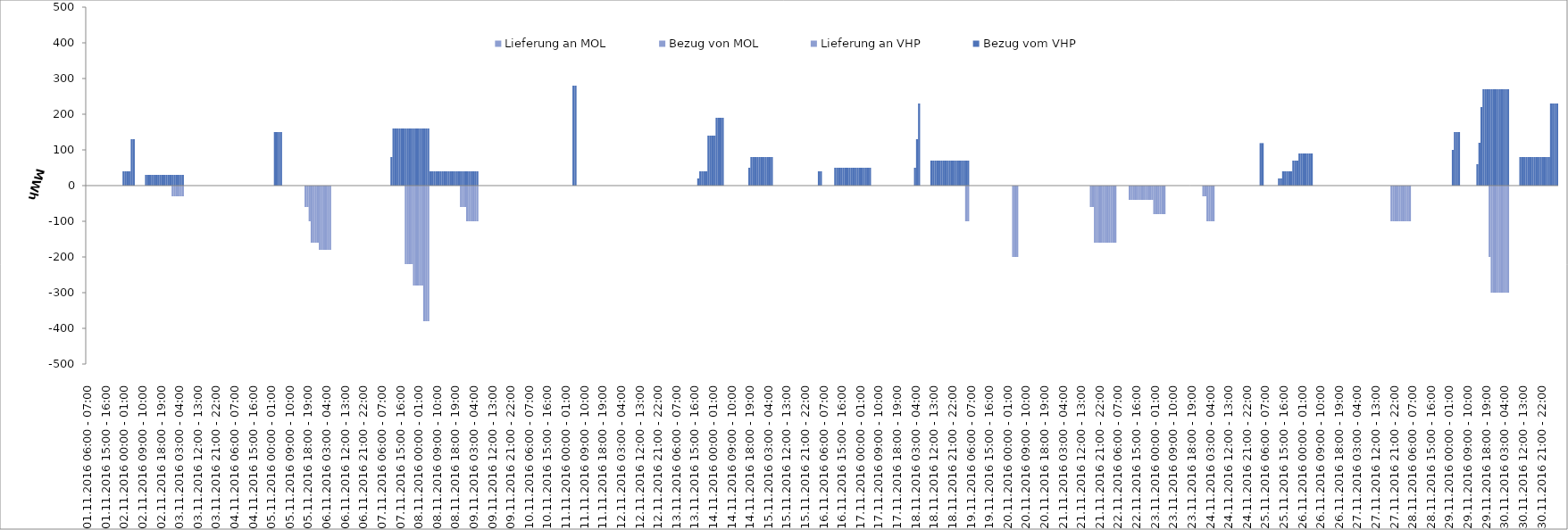
| Category | Bezug vom VHP | Lieferung an VHP | Bezug von MOL | Lieferung an MOL |
|---|---|---|---|---|
| 01.11.2016 06:00 - 07:00 | 0 | 0 | 0 | 0 |
| 01.11.2016 07:00 - 08:00 | 0 | 0 | 0 | 0 |
| 01.11.2016 08:00 - 09:00 | 0 | 0 | 0 | 0 |
| 01.11.2016 09:00 - 10:00 | 0 | 0 | 0 | 0 |
| 01.11.2016 10:00 - 11:00 | 0 | 0 | 0 | 0 |
| 01.11.2016 11:00 - 12:00 | 0 | 0 | 0 | 0 |
| 01.11.2016 12:00 - 13:00 | 0 | 0 | 0 | 0 |
| 01.11.2016 13:00 - 14:00 | 0 | 0 | 0 | 0 |
| 01.11.2016 14:00 - 15:00 | 0 | 0 | 0 | 0 |
| 01.11.2016 15:00 - 16:00 | 0 | 0 | 0 | 0 |
| 01.11.2016 16:00 - 17:00 | 0 | 0 | 0 | 0 |
| 01.11.2016 17:00 - 18:00 | 0 | 0 | 0 | 0 |
| 01.11.2016 18:00 - 19:00 | 0 | 0 | 0 | 0 |
| 01.11.2016 19:00 - 20:00 | 0 | 0 | 0 | 0 |
| 01.11.2016 20:00 - 21:00 | 0 | 0 | 0 | 0 |
| 01.11.2016 21:00 - 22:00 | 0 | 0 | 0 | 0 |
| 01.11.2016 22:00 - 23:00 | 0 | 0 | 0 | 0 |
| 01.11.2016 23:00 - 24:00 | 0 | 0 | 0 | 0 |
| 02.11.2016 00:00 - 01:00 | 40 | 0 | 0 | 0 |
| 02.11.2016 01:00 - 02:00 | 40 | 0 | 0 | 0 |
| 02.11.2016 02:00 - 03:00 | 40 | 0 | 0 | 0 |
| 02.11.2016 03:00 - 04:00 | 40 | 0 | 0 | 0 |
| 02.11.2016 04:00 - 05:00 | 130 | 0 | 0 | 0 |
| 02.11.2016 05:00 - 06:00 | 130 | 0 | 0 | 0 |
| 02.11.2016 06:00 - 07:00 | 0 | 0 | 0 | 0 |
| 02.11.2016 07:00 - 08:00 | 0 | 0 | 0 | 0 |
| 02.11.2016 08:00 - 09:00 | 0 | 0 | 0 | 0 |
| 02.11.2016 09:00 - 10:00 | 0 | 0 | 0 | 0 |
| 02.11.2016 10:00 - 11:00 | 0 | 0 | 0 | 0 |
| 02.11.2016 11:00 - 12:00 | 30 | 0 | 0 | 0 |
| 02.11.2016 12:00 - 13:00 | 30 | 0 | 0 | 0 |
| 02.11.2016 13:00 - 14:00 | 30 | 0 | 0 | 0 |
| 02.11.2016 14:00 - 15:00 | 30 | 0 | 0 | 0 |
| 02.11.2016 15:00 - 16:00 | 30 | 0 | 0 | 0 |
| 02.11.2016 16:00 - 17:00 | 30 | 0 | 0 | 0 |
| 02.11.2016 17:00 - 18:00 | 30 | 0 | 0 | 0 |
| 02.11.2016 18:00 - 19:00 | 30 | 0 | 0 | 0 |
| 02.11.2016 19:00 - 20:00 | 30 | 0 | 0 | 0 |
| 02.11.2016 20:00 - 21:00 | 30 | 0 | 0 | 0 |
| 02.11.2016 21:00 - 22:00 | 30 | 0 | 0 | 0 |
| 02.11.2016 22:00 - 23:00 | 30 | 0 | 0 | 0 |
| 02.11.2016 23:00 - 24:00 | 30 | 0 | 0 | 0 |
| 03.11.2016 00:00 - 01:00 | 30 | -30 | 0 | 0 |
| 03.11.2016 01:00 - 02:00 | 30 | -30 | 0 | 0 |
| 03.11.2016 02:00 - 03:00 | 30 | -30 | 0 | 0 |
| 03.11.2016 03:00 - 04:00 | 30 | -30 | 0 | 0 |
| 03.11.2016 04:00 - 05:00 | 30 | -30 | 0 | 0 |
| 03.11.2016 05:00 - 06:00 | 30 | -30 | 0 | 0 |
| 03.11.2016 06:00 - 07:00 | 0 | 0 | 0 | 0 |
| 03.11.2016 07:00 - 08:00 | 0 | 0 | 0 | 0 |
| 03.11.2016 08:00 - 09:00 | 0 | 0 | 0 | 0 |
| 03.11.2016 09:00 - 10:00 | 0 | 0 | 0 | 0 |
| 03.11.2016 10:00 - 11:00 | 0 | 0 | 0 | 0 |
| 03.11.2016 11:00 - 12:00 | 0 | 0 | 0 | 0 |
| 03.11.2016 12:00 - 13:00 | 0 | 0 | 0 | 0 |
| 03.11.2016 13:00 - 14:00 | 0 | 0 | 0 | 0 |
| 03.11.2016 14:00 - 15:00 | 0 | 0 | 0 | 0 |
| 03.11.2016 15:00 - 16:00 | 0 | 0 | 0 | 0 |
| 03.11.2016 16:00 - 17:00 | 0 | 0 | 0 | 0 |
| 03.11.2016 17:00 - 18:00 | 0 | 0 | 0 | 0 |
| 03.11.2016 18:00 - 19:00 | 0 | 0 | 0 | 0 |
| 03.11.2016 19:00 - 20:00 | 0 | 0 | 0 | 0 |
| 03.11.2016 20:00 - 21:00 | 0 | 0 | 0 | 0 |
| 03.11.2016 21:00 - 22:00 | 0 | 0 | 0 | 0 |
| 03.11.2016 22:00 - 23:00 | 0 | 0 | 0 | 0 |
| 03.11.2016 23:00 - 24:00 | 0 | 0 | 0 | 0 |
| 04.11.2016 00:00 - 01:00 | 0 | 0 | 0 | 0 |
| 04.11.2016 01:00 - 02:00 | 0 | 0 | 0 | 0 |
| 04.11.2016 02:00 - 03:00 | 0 | 0 | 0 | 0 |
| 04.11.2016 03:00 - 04:00 | 0 | 0 | 0 | 0 |
| 04.11.2016 04:00 - 05:00 | 0 | 0 | 0 | 0 |
| 04.11.2016 05:00 - 06:00 | 0 | 0 | 0 | 0 |
| 04.11.2016 06:00 - 07:00 | 0 | 0 | 0 | 0 |
| 04.11.2016 07:00 - 08:00 | 0 | 0 | 0 | 0 |
| 04.11.2016 08:00 - 09:00 | 0 | 0 | 0 | 0 |
| 04.11.2016 09:00 - 10:00 | 0 | 0 | 0 | 0 |
| 04.11.2016 10:00 - 11:00 | 0 | 0 | 0 | 0 |
| 04.11.2016 11:00 - 12:00 | 0 | 0 | 0 | 0 |
| 04.11.2016 12:00 - 13:00 | 0 | 0 | 0 | 0 |
| 04.11.2016 13:00 - 14:00 | 0 | 0 | 0 | 0 |
| 04.11.2016 14:00 - 15:00 | 0 | 0 | 0 | 0 |
| 04.11.2016 15:00 - 16:00 | 0 | 0 | 0 | 0 |
| 04.11.2016 16:00 - 17:00 | 0 | 0 | 0 | 0 |
| 04.11.2016 17:00 - 18:00 | 0 | 0 | 0 | 0 |
| 04.11.2016 18:00 - 19:00 | 0 | 0 | 0 | 0 |
| 04.11.2016 19:00 - 20:00 | 0 | 0 | 0 | 0 |
| 04.11.2016 20:00 - 21:00 | 0 | 0 | 0 | 0 |
| 04.11.2016 21:00 - 22:00 | 0 | 0 | 0 | 0 |
| 04.11.2016 22:00 - 23:00 | 0 | 0 | 0 | 0 |
| 04.11.2016 23:00 - 24:00 | 0 | 0 | 0 | 0 |
| 05.11.2016 00:00 - 01:00 | 0 | 0 | 0 | 0 |
| 05.11.2016 01:00 - 02:00 | 0 | 0 | 0 | 0 |
| 05.11.2016 02:00 - 03:00 | 150 | 0 | 0 | 0 |
| 05.11.2016 03:00 - 04:00 | 150 | 0 | 0 | 0 |
| 05.11.2016 04:00 - 05:00 | 150 | 0 | 0 | 0 |
| 05.11.2016 05:00 - 06:00 | 150 | 0 | 0 | 0 |
| 05.11.2016 06:00 - 07:00 | 0 | 0 | 0 | 0 |
| 05.11.2016 07:00 - 08:00 | 0 | 0 | 0 | 0 |
| 05.11.2016 08:00 - 09:00 | 0 | 0 | 0 | 0 |
| 05.11.2016 09:00 - 10:00 | 0 | 0 | 0 | 0 |
| 05.11.2016 10:00 - 11:00 | 0 | 0 | 0 | 0 |
| 05.11.2016 11:00 - 12:00 | 0 | 0 | 0 | 0 |
| 05.11.2016 12:00 - 13:00 | 0 | 0 | 0 | 0 |
| 05.11.2016 13:00 - 14:00 | 0 | 0 | 0 | 0 |
| 05.11.2016 14:00 - 15:00 | 0 | 0 | 0 | 0 |
| 05.11.2016 15:00 - 16:00 | 0 | 0 | 0 | 0 |
| 05.11.2016 16:00 - 17:00 | 0 | 0 | 0 | 0 |
| 05.11.2016 17:00 - 18:00 | 0 | -60 | 0 | 0 |
| 05.11.2016 18:00 - 19:00 | 0 | -60 | 0 | 0 |
| 05.11.2016 19:00 - 20:00 | 0 | -100 | 0 | 0 |
| 05.11.2016 20:00 - 21:00 | 0 | -160 | 0 | 0 |
| 05.11.2016 21:00 - 22:00 | 0 | -160 | 0 | 0 |
| 05.11.2016 22:00 - 23:00 | 0 | -160 | 0 | 0 |
| 05.11.2016 23:00 - 24:00 | 0 | -160 | 0 | 0 |
| 06.11.2016 00:00 - 01:00 | 0 | -180 | 0 | 0 |
| 06.11.2016 01:00 - 02:00 | 0 | -180 | 0 | 0 |
| 06.11.2016 02:00 - 03:00 | 0 | -180 | 0 | 0 |
| 06.11.2016 03:00 - 04:00 | 0 | -180 | 0 | 0 |
| 06.11.2016 04:00 - 05:00 | 0 | -180 | 0 | 0 |
| 06.11.2016 05:00 - 06:00 | 0 | -180 | 0 | 0 |
| 06.11.2016 06:00 - 07:00 | 0 | 0 | 0 | 0 |
| 06.11.2016 07:00 - 08:00 | 0 | 0 | 0 | 0 |
| 06.11.2016 08:00 - 09:00 | 0 | 0 | 0 | 0 |
| 06.11.2016 09:00 - 10:00 | 0 | 0 | 0 | 0 |
| 06.11.2016 10:00 - 11:00 | 0 | 0 | 0 | 0 |
| 06.11.2016 11:00 - 12:00 | 0 | 0 | 0 | 0 |
| 06.11.2016 12:00 - 13:00 | 0 | 0 | 0 | 0 |
| 06.11.2016 13:00 - 14:00 | 0 | 0 | 0 | 0 |
| 06.11.2016 14:00 - 15:00 | 0 | 0 | 0 | 0 |
| 06.11.2016 15:00 - 16:00 | 0 | 0 | 0 | 0 |
| 06.11.2016 16:00 - 17:00 | 0 | 0 | 0 | 0 |
| 06.11.2016 17:00 - 18:00 | 0 | 0 | 0 | 0 |
| 06.11.2016 18:00 - 19:00 | 0 | 0 | 0 | 0 |
| 06.11.2016 19:00 - 20:00 | 0 | 0 | 0 | 0 |
| 06.11.2016 20:00 - 21:00 | 0 | 0 | 0 | 0 |
| 06.11.2016 21:00 - 22:00 | 0 | 0 | 0 | 0 |
| 06.11.2016 22:00 - 23:00 | 0 | 0 | 0 | 0 |
| 06.11.2016 23:00 - 24:00 | 0 | 0 | 0 | 0 |
| 07.11.2016 00:00 - 01:00 | 0 | 0 | 0 | 0 |
| 07.11.2016 01:00 - 02:00 | 0 | 0 | 0 | 0 |
| 07.11.2016 02:00 - 03:00 | 0 | 0 | 0 | 0 |
| 07.11.2016 03:00 - 04:00 | 0 | 0 | 0 | 0 |
| 07.11.2016 04:00 - 05:00 | 0 | 0 | 0 | 0 |
| 07.11.2016 05:00 - 06:00 | 0 | 0 | 0 | 0 |
| 07.11.2016 06:00 - 07:00 | 0 | 0 | 0 | 0 |
| 07.11.2016 07:00 - 08:00 | 0 | 0 | 0 | 0 |
| 07.11.2016 08:00 - 09:00 | 0 | 0 | 0 | 0 |
| 07.11.2016 09:00 - 10:00 | 0 | 0 | 0 | 0 |
| 07.11.2016 10:00 - 11:00 | 0 | 0 | 0 | 0 |
| 07.11.2016 11:00 - 12:00 | 80 | 0 | 0 | 0 |
| 07.11.2016 12:00 - 13:00 | 160 | 0 | 0 | 0 |
| 07.11.2016 13:00 - 14:00 | 160 | 0 | 0 | 0 |
| 07.11.2016 14:00 - 15:00 | 160 | 0 | 0 | 0 |
| 07.11.2016 15:00 - 16:00 | 160 | 0 | 0 | 0 |
| 07.11.2016 16:00 - 17:00 | 160 | 0 | 0 | 0 |
| 07.11.2016 17:00 - 18:00 | 160 | 0 | 0 | 0 |
| 07.11.2016 18:00 - 19:00 | 160 | -220 | 0 | 0 |
| 07.11.2016 19:00 - 20:00 | 160 | -220 | 0 | 0 |
| 07.11.2016 20:00 - 21:00 | 160 | -220 | 0 | 0 |
| 07.11.2016 21:00 - 22:00 | 160 | -220 | 0 | 0 |
| 07.11.2016 22:00 - 23:00 | 160 | -280 | 0 | 0 |
| 07.11.2016 23:00 - 24:00 | 160 | -280 | 0 | 0 |
| 08.11.2016 00:00 - 01:00 | 160 | -280 | 0 | 0 |
| 08.11.2016 01:00 - 02:00 | 160 | -280 | 0 | 0 |
| 08.11.2016 02:00 - 03:00 | 160 | -280 | 0 | 0 |
| 08.11.2016 03:00 - 04:00 | 160 | -380 | 0 | 0 |
| 08.11.2016 04:00 - 05:00 | 160 | -380 | 0 | 0 |
| 08.11.2016 05:00 - 06:00 | 160 | -380 | 0 | 0 |
| 08.11.2016 06:00 - 07:00 | 40 | 0 | 0 | 0 |
| 08.11.2016 07:00 - 08:00 | 40 | 0 | 0 | 0 |
| 08.11.2016 08:00 - 09:00 | 40 | 0 | 0 | 0 |
| 08.11.2016 09:00 - 10:00 | 40 | 0 | 0 | 0 |
| 08.11.2016 10:00 - 11:00 | 40 | 0 | 0 | 0 |
| 08.11.2016 11:00 - 12:00 | 40 | 0 | 0 | 0 |
| 08.11.2016 12:00 - 13:00 | 40 | 0 | 0 | 0 |
| 08.11.2016 13:00 - 14:00 | 40 | 0 | 0 | 0 |
| 08.11.2016 14:00 - 15:00 | 40 | 0 | 0 | 0 |
| 08.11.2016 15:00 - 16:00 | 40 | 0 | 0 | 0 |
| 08.11.2016 16:00 - 17:00 | 40 | 0 | 0 | 0 |
| 08.11.2016 17:00 - 18:00 | 40 | 0 | 0 | 0 |
| 08.11.2016 18:00 - 19:00 | 40 | 0 | 0 | 0 |
| 08.11.2016 19:00 - 20:00 | 40 | 0 | 0 | 0 |
| 08.11.2016 20:00 - 21:00 | 40 | 0 | 0 | 0 |
| 08.11.2016 21:00 - 22:00 | 40 | -60 | 0 | 0 |
| 08.11.2016 22:00 - 23:00 | 40 | -60 | 0 | 0 |
| 08.11.2016 23:00 - 24:00 | 40 | -60 | 0 | 0 |
| 09.11.2016 00:00 - 01:00 | 40 | -100 | 0 | 0 |
| 09.11.2016 01:00 - 02:00 | 40 | -100 | 0 | 0 |
| 09.11.2016 02:00 - 03:00 | 40 | -100 | 0 | 0 |
| 09.11.2016 03:00 - 04:00 | 40 | -100 | 0 | 0 |
| 09.11.2016 04:00 - 05:00 | 40 | -100 | 0 | 0 |
| 09.11.2016 05:00 - 06:00 | 40 | -100 | 0 | 0 |
| 09.11.2016 06:00 - 07:00 | 0 | 0 | 0 | 0 |
| 09.11.2016 07:00 - 08:00 | 0 | 0 | 0 | 0 |
| 09.11.2016 08:00 - 09:00 | 0 | 0 | 0 | 0 |
| 09.11.2016 09:00 - 10:00 | 0 | 0 | 0 | 0 |
| 09.11.2016 10:00 - 11:00 | 0 | 0 | 0 | 0 |
| 09.11.2016 11:00 - 12:00 | 0 | 0 | 0 | 0 |
| 09.11.2016 12:00 - 13:00 | 0 | 0 | 0 | 0 |
| 09.11.2016 13:00 - 14:00 | 0 | 0 | 0 | 0 |
| 09.11.2016 14:00 - 15:00 | 0 | 0 | 0 | 0 |
| 09.11.2016 15:00 - 16:00 | 0 | 0 | 0 | 0 |
| 09.11.2016 16:00 - 17:00 | 0 | 0 | 0 | 0 |
| 09.11.2016 17:00 - 18:00 | 0 | 0 | 0 | 0 |
| 09.11.2016 18:00 - 19:00 | 0 | 0 | 0 | 0 |
| 09.11.2016 19:00 - 20:00 | 0 | 0 | 0 | 0 |
| 09.11.2016 20:00 - 21:00 | 0 | 0 | 0 | 0 |
| 09.11.2016 21:00 - 22:00 | 0 | 0 | 0 | 0 |
| 09.11.2016 22:00 - 23:00 | 0 | 0 | 0 | 0 |
| 09.11.2016 23:00 - 24:00 | 0 | 0 | 0 | 0 |
| 10.11.2016 00:00 - 01:00 | 0 | 0 | 0 | 0 |
| 10.11.2016 01:00 - 02:00 | 0 | 0 | 0 | 0 |
| 10.11.2016 02:00 - 03:00 | 0 | 0 | 0 | 0 |
| 10.11.2016 03:00 - 04:00 | 0 | 0 | 0 | 0 |
| 10.11.2016 04:00 - 05:00 | 0 | 0 | 0 | 0 |
| 10.11.2016 05:00 - 06:00 | 0 | 0 | 0 | 0 |
| 10.11.2016 06:00 - 07:00 | 0 | 0 | 0 | 0 |
| 10.11.2016 07:00 - 08:00 | 0 | 0 | 0 | 0 |
| 10.11.2016 08:00 - 09:00 | 0 | 0 | 0 | 0 |
| 10.11.2016 09:00 - 10:00 | 0 | 0 | 0 | 0 |
| 10.11.2016 10:00 - 11:00 | 0 | 0 | 0 | 0 |
| 10.11.2016 11:00 - 12:00 | 0 | 0 | 0 | 0 |
| 10.11.2016 12:00 - 13:00 | 0 | 0 | 0 | 0 |
| 10.11.2016 13:00 - 14:00 | 0 | 0 | 0 | 0 |
| 10.11.2016 14:00 - 15:00 | 0 | 0 | 0 | 0 |
| 10.11.2016 15:00 - 16:00 | 0 | 0 | 0 | 0 |
| 10.11.2016 16:00 - 17:00 | 0 | 0 | 0 | 0 |
| 10.11.2016 17:00 - 18:00 | 0 | 0 | 0 | 0 |
| 10.11.2016 18:00 - 19:00 | 0 | 0 | 0 | 0 |
| 10.11.2016 19:00 - 20:00 | 0 | 0 | 0 | 0 |
| 10.11.2016 20:00 - 21:00 | 0 | 0 | 0 | 0 |
| 10.11.2016 21:00 - 22:00 | 0 | 0 | 0 | 0 |
| 10.11.2016 22:00 - 23:00 | 0 | 0 | 0 | 0 |
| 10.11.2016 23:00 - 24:00 | 0 | 0 | 0 | 0 |
| 11.11.2016 00:00 - 01:00 | 0 | 0 | 0 | 0 |
| 11.11.2016 01:00 - 02:00 | 0 | 0 | 0 | 0 |
| 11.11.2016 02:00 - 03:00 | 0 | 0 | 0 | 0 |
| 11.11.2016 03:00 - 04:00 | 0 | 0 | 0 | 0 |
| 11.11.2016 04:00 - 05:00 | 280 | 0 | 0 | 0 |
| 11.11.2016 05:00 - 06:00 | 280 | 0 | 0 | 0 |
| 11.11.2016 06:00 - 07:00 | 0 | 0 | 0 | 0 |
| 11.11.2016 07:00 - 08:00 | 0 | 0 | 0 | 0 |
| 11.11.2016 08:00 - 09:00 | 0 | 0 | 0 | 0 |
| 11.11.2016 09:00 - 10:00 | 0 | 0 | 0 | 0 |
| 11.11.2016 10:00 - 11:00 | 0 | 0 | 0 | 0 |
| 11.11.2016 11:00 - 12:00 | 0 | 0 | 0 | 0 |
| 11.11.2016 12:00 - 13:00 | 0 | 0 | 0 | 0 |
| 11.11.2016 13:00 - 14:00 | 0 | 0 | 0 | 0 |
| 11.11.2016 14:00 - 15:00 | 0 | 0 | 0 | 0 |
| 11.11.2016 15:00 - 16:00 | 0 | 0 | 0 | 0 |
| 11.11.2016 16:00 - 17:00 | 0 | 0 | 0 | 0 |
| 11.11.2016 17:00 - 18:00 | 0 | 0 | 0 | 0 |
| 11.11.2016 18:00 - 19:00 | 0 | 0 | 0 | 0 |
| 11.11.2016 19:00 - 20:00 | 0 | 0 | 0 | 0 |
| 11.11.2016 20:00 - 21:00 | 0 | 0 | 0 | 0 |
| 11.11.2016 21:00 - 22:00 | 0 | 0 | 0 | 0 |
| 11.11.2016 22:00 - 23:00 | 0 | 0 | 0 | 0 |
| 11.11.2016 23:00 - 24:00 | 0 | 0 | 0 | 0 |
| 12.11.2016 00:00 - 01:00 | 0 | 0 | 0 | 0 |
| 12.11.2016 01:00 - 02:00 | 0 | 0 | 0 | 0 |
| 12.11.2016 02:00 - 03:00 | 0 | 0 | 0 | 0 |
| 12.11.2016 03:00 - 04:00 | 0 | 0 | 0 | 0 |
| 12.11.2016 04:00 - 05:00 | 0 | 0 | 0 | 0 |
| 12.11.2016 05:00 - 06:00 | 0 | 0 | 0 | 0 |
| 12.11.2016 06:00 - 07:00 | 0 | 0 | 0 | 0 |
| 12.11.2016 07:00 - 08:00 | 0 | 0 | 0 | 0 |
| 12.11.2016 08:00 - 09:00 | 0 | 0 | 0 | 0 |
| 12.11.2016 09:00 - 10:00 | 0 | 0 | 0 | 0 |
| 12.11.2016 10:00 - 11:00 | 0 | 0 | 0 | 0 |
| 12.11.2016 11:00 - 12:00 | 0 | 0 | 0 | 0 |
| 12.11.2016 12:00 - 13:00 | 0 | 0 | 0 | 0 |
| 12.11.2016 13:00 - 14:00 | 0 | 0 | 0 | 0 |
| 12.11.2016 14:00 - 15:00 | 0 | 0 | 0 | 0 |
| 12.11.2016 15:00 - 16:00 | 0 | 0 | 0 | 0 |
| 12.11.2016 16:00 - 17:00 | 0 | 0 | 0 | 0 |
| 12.11.2016 17:00 - 18:00 | 0 | 0 | 0 | 0 |
| 12.11.2016 18:00 - 19:00 | 0 | 0 | 0 | 0 |
| 12.11.2016 19:00 - 20:00 | 0 | 0 | 0 | 0 |
| 12.11.2016 20:00 - 21:00 | 0 | 0 | 0 | 0 |
| 12.11.2016 21:00 - 22:00 | 0 | 0 | 0 | 0 |
| 12.11.2016 22:00 - 23:00 | 0 | 0 | 0 | 0 |
| 12.11.2016 23:00 - 24:00 | 0 | 0 | 0 | 0 |
| 13.11.2016 00:00 - 01:00 | 0 | 0 | 0 | 0 |
| 13.11.2016 01:00 - 02:00 | 0 | 0 | 0 | 0 |
| 13.11.2016 02:00 - 03:00 | 0 | 0 | 0 | 0 |
| 13.11.2016 03:00 - 04:00 | 0 | 0 | 0 | 0 |
| 13.11.2016 04:00 - 05:00 | 0 | 0 | 0 | 0 |
| 13.11.2016 05:00 - 06:00 | 0 | 0 | 0 | 0 |
| 13.11.2016 06:00 - 07:00 | 0 | 0 | 0 | 0 |
| 13.11.2016 07:00 - 08:00 | 0 | 0 | 0 | 0 |
| 13.11.2016 08:00 - 09:00 | 0 | 0 | 0 | 0 |
| 13.11.2016 09:00 - 10:00 | 0 | 0 | 0 | 0 |
| 13.11.2016 10:00 - 11:00 | 0 | 0 | 0 | 0 |
| 13.11.2016 11:00 - 12:00 | 0 | 0 | 0 | 0 |
| 13.11.2016 12:00 - 13:00 | 0 | 0 | 0 | 0 |
| 13.11.2016 13:00 - 14:00 | 0 | 0 | 0 | 0 |
| 13.11.2016 14:00 - 15:00 | 0 | 0 | 0 | 0 |
| 13.11.2016 15:00 - 16:00 | 0 | 0 | 0 | 0 |
| 13.11.2016 16:00 - 17:00 | 0 | 0 | 0 | 0 |
| 13.11.2016 17:00 - 18:00 | 20 | 0 | 0 | 0 |
| 13.11.2016 18:00 - 19:00 | 40 | 0 | 0 | 0 |
| 13.11.2016 19:00 - 20:00 | 40 | 0 | 0 | 0 |
| 13.11.2016 20:00 - 21:00 | 40 | 0 | 0 | 0 |
| 13.11.2016 21:00 - 22:00 | 40 | 0 | 0 | 0 |
| 13.11.2016 22:00 - 23:00 | 140 | 0 | 0 | 0 |
| 13.11.2016 23:00 - 24:00 | 140 | 0 | 0 | 0 |
| 14.11.2016 00:00 - 01:00 | 140 | 0 | 0 | 0 |
| 14.11.2016 01:00 - 02:00 | 140 | 0 | 0 | 0 |
| 14.11.2016 02:00 - 03:00 | 190 | 0 | 0 | 0 |
| 14.11.2016 03:00 - 04:00 | 190 | 0 | 0 | 0 |
| 14.11.2016 04:00 - 05:00 | 190 | 0 | 0 | 0 |
| 14.11.2016 05:00 - 06:00 | 190 | 0 | 0 | 0 |
| 14.11.2016 06:00 - 07:00 | 0 | 0 | 0 | 0 |
| 14.11.2016 07:00 - 08:00 | 0 | 0 | 0 | 0 |
| 14.11.2016 08:00 - 09:00 | 0 | 0 | 0 | 0 |
| 14.11.2016 09:00 - 10:00 | 0 | 0 | 0 | 0 |
| 14.11.2016 10:00 - 11:00 | 0 | 0 | 0 | 0 |
| 14.11.2016 11:00 - 12:00 | 0 | 0 | 0 | 0 |
| 14.11.2016 12:00 - 13:00 | 0 | 0 | 0 | 0 |
| 14.11.2016 13:00 - 14:00 | 0 | 0 | 0 | 0 |
| 14.11.2016 14:00 - 15:00 | 0 | 0 | 0 | 0 |
| 14.11.2016 15:00 - 16:00 | 0 | 0 | 0 | 0 |
| 14.11.2016 16:00 - 17:00 | 0 | 0 | 0 | 0 |
| 14.11.2016 17:00 - 18:00 | 0 | 0 | 0 | 0 |
| 14.11.2016 18:00 - 19:00 | 50 | 0 | 0 | 0 |
| 14.11.2016 19:00 - 20:00 | 80 | 0 | 0 | 0 |
| 14.11.2016 20:00 - 21:00 | 80 | 0 | 0 | 0 |
| 14.11.2016 21:00 - 22:00 | 80 | 0 | 0 | 0 |
| 14.11.2016 22:00 - 23:00 | 80 | 0 | 0 | 0 |
| 14.11.2016 23:00 - 24:00 | 80 | 0 | 0 | 0 |
| 15.11.2016 00:00 - 01:00 | 80 | 0 | 0 | 0 |
| 15.11.2016 01:00 - 02:00 | 80 | 0 | 0 | 0 |
| 15.11.2016 02:00 - 03:00 | 80 | 0 | 0 | 0 |
| 15.11.2016 03:00 - 04:00 | 80 | 0 | 0 | 0 |
| 15.11.2016 04:00 - 05:00 | 80 | 0 | 0 | 0 |
| 15.11.2016 05:00 - 06:00 | 80 | 0 | 0 | 0 |
| 15.11.2016 06:00 - 07:00 | 0 | 0 | 0 | 0 |
| 15.11.2016 07:00 - 08:00 | 0 | 0 | 0 | 0 |
| 15.11.2016 08:00 - 09:00 | 0 | 0 | 0 | 0 |
| 15.11.2016 09:00 - 10:00 | 0 | 0 | 0 | 0 |
| 15.11.2016 10:00 - 11:00 | 0 | 0 | 0 | 0 |
| 15.11.2016 11:00 - 12:00 | 0 | 0 | 0 | 0 |
| 15.11.2016 12:00 - 13:00 | 0 | 0 | 0 | 0 |
| 15.11.2016 13:00 - 14:00 | 0 | 0 | 0 | 0 |
| 15.11.2016 14:00 - 15:00 | 0 | 0 | 0 | 0 |
| 15.11.2016 15:00 - 16:00 | 0 | 0 | 0 | 0 |
| 15.11.2016 16:00 - 17:00 | 0 | 0 | 0 | 0 |
| 15.11.2016 17:00 - 18:00 | 0 | 0 | 0 | 0 |
| 15.11.2016 18:00 - 19:00 | 0 | 0 | 0 | 0 |
| 15.11.2016 19:00 - 20:00 | 0 | 0 | 0 | 0 |
| 15.11.2016 20:00 - 21:00 | 0 | 0 | 0 | 0 |
| 15.11.2016 21:00 - 22:00 | 0 | 0 | 0 | 0 |
| 15.11.2016 22:00 - 23:00 | 0 | 0 | 0 | 0 |
| 15.11.2016 23:00 - 24:00 | 0 | 0 | 0 | 0 |
| 16.11.2016 00:00 - 01:00 | 0 | 0 | 0 | 0 |
| 16.11.2016 01:00 - 02:00 | 0 | 0 | 0 | 0 |
| 16.11.2016 02:00 - 03:00 | 0 | 0 | 0 | 0 |
| 16.11.2016 03:00 - 04:00 | 0 | 0 | 0 | 0 |
| 16.11.2016 04:00 - 05:00 | 40 | 0 | 0 | 0 |
| 16.11.2016 05:00 - 06:00 | 40 | 0 | 0 | 0 |
| 16.11.2016 06:00 - 07:00 | 0 | 0 | 0 | 0 |
| 16.11.2016 07:00 - 08:00 | 0 | 0 | 0 | 0 |
| 16.11.2016 08:00 - 09:00 | 0 | 0 | 0 | 0 |
| 16.11.2016 09:00 - 10:00 | 0 | 0 | 0 | 0 |
| 16.11.2016 10:00 - 11:00 | 0 | 0 | 0 | 0 |
| 16.11.2016 11:00 - 12:00 | 0 | 0 | 0 | 0 |
| 16.11.2016 12:00 - 13:00 | 50 | 0 | 0 | 0 |
| 16.11.2016 13:00 - 14:00 | 50 | 0 | 0 | 0 |
| 16.11.2016 14:00 - 15:00 | 50 | 0 | 0 | 0 |
| 16.11.2016 15:00 - 16:00 | 50 | 0 | 0 | 0 |
| 16.11.2016 16:00 - 17:00 | 50 | 0 | 0 | 0 |
| 16.11.2016 17:00 - 18:00 | 50 | 0 | 0 | 0 |
| 16.11.2016 18:00 - 19:00 | 50 | 0 | 0 | 0 |
| 16.11.2016 19:00 - 20:00 | 50 | 0 | 0 | 0 |
| 16.11.2016 20:00 - 21:00 | 50 | 0 | 0 | 0 |
| 16.11.2016 21:00 - 22:00 | 50 | 0 | 0 | 0 |
| 16.11.2016 22:00 - 23:00 | 50 | 0 | 0 | 0 |
| 16.11.2016 23:00 - 24:00 | 50 | 0 | 0 | 0 |
| 17.11.2016 00:00 - 01:00 | 50 | 0 | 0 | 0 |
| 17.11.2016 01:00 - 02:00 | 50 | 0 | 0 | 0 |
| 17.11.2016 02:00 - 03:00 | 50 | 0 | 0 | 0 |
| 17.11.2016 03:00 - 04:00 | 50 | 0 | 0 | 0 |
| 17.11.2016 04:00 - 05:00 | 50 | 0 | 0 | 0 |
| 17.11.2016 05:00 - 06:00 | 50 | 0 | 0 | 0 |
| 17.11.2016 06:00 - 07:00 | 0 | 0 | 0 | 0 |
| 17.11.2016 07:00 - 08:00 | 0 | 0 | 0 | 0 |
| 17.11.2016 08:00 - 09:00 | 0 | 0 | 0 | 0 |
| 17.11.2016 09:00 - 10:00 | 0 | 0 | 0 | 0 |
| 17.11.2016 10:00 - 11:00 | 0 | 0 | 0 | 0 |
| 17.11.2016 11:00 - 12:00 | 0 | 0 | 0 | 0 |
| 17.11.2016 12:00 - 13:00 | 0 | 0 | 0 | 0 |
| 17.11.2016 13:00 - 14:00 | 0 | 0 | 0 | 0 |
| 17.11.2016 14:00 - 15:00 | 0 | 0 | 0 | 0 |
| 17.11.2016 15:00 - 16:00 | 0 | 0 | 0 | 0 |
| 17.11.2016 16:00 - 17:00 | 0 | 0 | 0 | 0 |
| 17.11.2016 17:00 - 18:00 | 0 | 0 | 0 | 0 |
| 17.11.2016 18:00 - 19:00 | 0 | 0 | 0 | 0 |
| 17.11.2016 19:00 - 20:00 | 0 | 0 | 0 | 0 |
| 17.11.2016 20:00 - 21:00 | 0 | 0 | 0 | 0 |
| 17.11.2016 21:00 - 22:00 | 0 | 0 | 0 | 0 |
| 17.11.2016 22:00 - 23:00 | 0 | 0 | 0 | 0 |
| 17.11.2016 23:00 - 24:00 | 0 | 0 | 0 | 0 |
| 18.11.2016 00:00 - 01:00 | 0 | 0 | 0 | 0 |
| 18.11.2016 01:00 - 02:00 | 0 | 0 | 0 | 0 |
| 18.11.2016 02:00 - 03:00 | 0 | 0 | 0 | 0 |
| 18.11.2016 03:00 - 04:00 | 50 | 0 | 0 | 0 |
| 18.11.2016 04:00 - 05:00 | 130 | 0 | 0 | 0 |
| 18.11.2016 05:00 - 06:00 | 230 | 0 | 0 | 0 |
| 18.11.2016 06:00 - 07:00 | 0 | 0 | 0 | 0 |
| 18.11.2016 07:00 - 08:00 | 0 | 0 | 0 | 0 |
| 18.11.2016 08:00 - 09:00 | 0 | 0 | 0 | 0 |
| 18.11.2016 09:00 - 10:00 | 0 | 0 | 0 | 0 |
| 18.11.2016 10:00 - 11:00 | 0 | 0 | 0 | 0 |
| 18.11.2016 11:00 - 12:00 | 70 | 0 | 0 | 0 |
| 18.11.2016 12:00 - 13:00 | 70 | 0 | 0 | 0 |
| 18.11.2016 13:00 - 14:00 | 70 | 0 | 0 | 0 |
| 18.11.2016 14:00 - 15:00 | 70 | 0 | 0 | 0 |
| 18.11.2016 15:00 - 16:00 | 70 | 0 | 0 | 0 |
| 18.11.2016 16:00 - 17:00 | 70 | 0 | 0 | 0 |
| 18.11.2016 17:00 - 18:00 | 70 | 0 | 0 | 0 |
| 18.11.2016 18:00 - 19:00 | 70 | 0 | 0 | 0 |
| 18.11.2016 19:00 - 20:00 | 70 | 0 | 0 | 0 |
| 18.11.2016 20:00 - 21:00 | 70 | 0 | 0 | 0 |
| 18.11.2016 21:00 - 22:00 | 70 | 0 | 0 | 0 |
| 18.11.2016 22:00 - 23:00 | 70 | 0 | 0 | 0 |
| 18.11.2016 23:00 - 24:00 | 70 | 0 | 0 | 0 |
| 19.11.2016 00:00 - 01:00 | 70 | 0 | 0 | 0 |
| 19.11.2016 01:00 - 02:00 | 70 | 0 | 0 | 0 |
| 19.11.2016 02:00 - 03:00 | 70 | 0 | 0 | 0 |
| 19.11.2016 03:00 - 04:00 | 70 | 0 | 0 | 0 |
| 19.11.2016 04:00 - 05:00 | 70 | -100 | 0 | 0 |
| 19.11.2016 05:00 - 06:00 | 70 | -100 | 0 | 0 |
| 19.11.2016 06:00 - 07:00 | 0 | 0 | 0 | 0 |
| 19.11.2016 07:00 - 08:00 | 0 | 0 | 0 | 0 |
| 19.11.2016 08:00 - 09:00 | 0 | 0 | 0 | 0 |
| 19.11.2016 09:00 - 10:00 | 0 | 0 | 0 | 0 |
| 19.11.2016 10:00 - 11:00 | 0 | 0 | 0 | 0 |
| 19.11.2016 11:00 - 12:00 | 0 | 0 | 0 | 0 |
| 19.11.2016 12:00 - 13:00 | 0 | 0 | 0 | 0 |
| 19.11.2016 13:00 - 14:00 | 0 | 0 | 0 | 0 |
| 19.11.2016 14:00 - 15:00 | 0 | 0 | 0 | 0 |
| 19.11.2016 15:00 - 16:00 | 0 | 0 | 0 | 0 |
| 19.11.2016 16:00 - 17:00 | 0 | 0 | 0 | 0 |
| 19.11.2016 17:00 - 18:00 | 0 | 0 | 0 | 0 |
| 19.11.2016 18:00 - 19:00 | 0 | 0 | 0 | 0 |
| 19.11.2016 19:00 - 20:00 | 0 | 0 | 0 | 0 |
| 19.11.2016 20:00 - 21:00 | 0 | 0 | 0 | 0 |
| 19.11.2016 21:00 - 22:00 | 0 | 0 | 0 | 0 |
| 19.11.2016 22:00 - 23:00 | 0 | 0 | 0 | 0 |
| 19.11.2016 23:00 - 24:00 | 0 | 0 | 0 | 0 |
| 20.11.2016 00:00 - 01:00 | 0 | 0 | 0 | 0 |
| 20.11.2016 01:00 - 02:00 | 0 | 0 | 0 | 0 |
| 20.11.2016 02:00 - 03:00 | 0 | 0 | 0 | 0 |
| 20.11.2016 03:00 - 04:00 | 0 | -200 | 0 | 0 |
| 20.11.2016 04:00 - 05:00 | 0 | -200 | 0 | 0 |
| 20.11.2016 05:00 - 06:00 | 0 | -200 | 0 | 0 |
| 20.11.2016 06:00 - 07:00 | 0 | 0 | 0 | 0 |
| 20.11.2016 07:00 - 08:00 | 0 | 0 | 0 | 0 |
| 20.11.2016 08:00 - 09:00 | 0 | 0 | 0 | 0 |
| 20.11.2016 09:00 - 10:00 | 0 | 0 | 0 | 0 |
| 20.11.2016 10:00 - 11:00 | 0 | 0 | 0 | 0 |
| 20.11.2016 11:00 - 12:00 | 0 | 0 | 0 | 0 |
| 20.11.2016 12:00 - 13:00 | 0 | 0 | 0 | 0 |
| 20.11.2016 13:00 - 14:00 | 0 | 0 | 0 | 0 |
| 20.11.2016 14:00 - 15:00 | 0 | 0 | 0 | 0 |
| 20.11.2016 15:00 - 16:00 | 0 | 0 | 0 | 0 |
| 20.11.2016 16:00 - 17:00 | 0 | 0 | 0 | 0 |
| 20.11.2016 17:00 - 18:00 | 0 | 0 | 0 | 0 |
| 20.11.2016 18:00 - 19:00 | 0 | 0 | 0 | 0 |
| 20.11.2016 19:00 - 20:00 | 0 | 0 | 0 | 0 |
| 20.11.2016 20:00 - 21:00 | 0 | 0 | 0 | 0 |
| 20.11.2016 21:00 - 22:00 | 0 | 0 | 0 | 0 |
| 20.11.2016 22:00 - 23:00 | 0 | 0 | 0 | 0 |
| 20.11.2016 23:00 - 24:00 | 0 | 0 | 0 | 0 |
| 21.11.2016 00:00 - 01:00 | 0 | 0 | 0 | 0 |
| 21.11.2016 01:00 - 02:00 | 0 | 0 | 0 | 0 |
| 21.11.2016 02:00 - 03:00 | 0 | 0 | 0 | 0 |
| 21.11.2016 03:00 - 04:00 | 0 | 0 | 0 | 0 |
| 21.11.2016 04:00 - 05:00 | 0 | 0 | 0 | 0 |
| 21.11.2016 05:00 - 06:00 | 0 | 0 | 0 | 0 |
| 21.11.2016 06:00 - 07:00 | 0 | 0 | 0 | 0 |
| 21.11.2016 07:00 - 08:00 | 0 | 0 | 0 | 0 |
| 21.11.2016 08:00 - 09:00 | 0 | 0 | 0 | 0 |
| 21.11.2016 09:00 - 10:00 | 0 | 0 | 0 | 0 |
| 21.11.2016 10:00 - 11:00 | 0 | 0 | 0 | 0 |
| 21.11.2016 11:00 - 12:00 | 0 | 0 | 0 | 0 |
| 21.11.2016 12:00 - 13:00 | 0 | 0 | 0 | 0 |
| 21.11.2016 13:00 - 14:00 | 0 | 0 | 0 | 0 |
| 21.11.2016 14:00 - 15:00 | 0 | 0 | 0 | 0 |
| 21.11.2016 15:00 - 16:00 | 0 | 0 | 0 | 0 |
| 21.11.2016 16:00 - 17:00 | 0 | 0 | 0 | 0 |
| 21.11.2016 17:00 - 18:00 | 0 | -60 | 0 | 0 |
| 21.11.2016 18:00 - 19:00 | 0 | -60 | 0 | 0 |
| 21.11.2016 19:00 - 20:00 | 0 | -160 | 0 | 0 |
| 21.11.2016 20:00 - 21:00 | 0 | -160 | 0 | 0 |
| 21.11.2016 21:00 - 22:00 | 0 | -160 | 0 | 0 |
| 21.11.2016 22:00 - 23:00 | 0 | -160 | 0 | 0 |
| 21.11.2016 23:00 - 24:00 | 0 | -160 | 0 | 0 |
| 22.11.2016 00:00 - 01:00 | 0 | -160 | 0 | 0 |
| 22.11.2016 01:00 - 02:00 | 0 | -160 | 0 | 0 |
| 22.11.2016 02:00 - 03:00 | 0 | -160 | 0 | 0 |
| 22.11.2016 03:00 - 04:00 | 0 | -160 | 0 | 0 |
| 22.11.2016 04:00 - 05:00 | 0 | -160 | 0 | 0 |
| 22.11.2016 05:00 - 06:00 | 0 | -160 | 0 | 0 |
| 22.11.2016 06:00 - 07:00 | 0 | 0 | 0 | 0 |
| 22.11.2016 07:00 - 08:00 | 0 | 0 | 0 | 0 |
| 22.11.2016 08:00 - 09:00 | 0 | 0 | 0 | 0 |
| 22.11.2016 09:00 - 10:00 | 0 | 0 | 0 | 0 |
| 22.11.2016 10:00 - 11:00 | 0 | 0 | 0 | 0 |
| 22.11.2016 11:00 - 12:00 | 0 | 0 | 0 | 0 |
| 22.11.2016 12:00 - 13:00 | 0 | -40 | 0 | 0 |
| 22.11.2016 13:00 - 14:00 | 0 | -40 | 0 | 0 |
| 22.11.2016 14:00 - 15:00 | 0 | -40 | 0 | 0 |
| 22.11.2016 15:00 - 16:00 | 0 | -40 | 0 | 0 |
| 22.11.2016 16:00 - 17:00 | 0 | -40 | 0 | 0 |
| 22.11.2016 17:00 - 18:00 | 0 | -40 | 0 | 0 |
| 22.11.2016 18:00 - 19:00 | 0 | -40 | 0 | 0 |
| 22.11.2016 19:00 - 20:00 | 0 | -40 | 0 | 0 |
| 22.11.2016 20:00 - 21:00 | 0 | -40 | 0 | 0 |
| 22.11.2016 21:00 - 22:00 | 0 | -40 | 0 | 0 |
| 22.11.2016 22:00 - 23:00 | 0 | -40 | 0 | 0 |
| 22.11.2016 23:00 - 24:00 | 0 | -40 | 0 | 0 |
| 23.11.2016 00:00 - 01:00 | 0 | -80 | 0 | 0 |
| 23.11.2016 01:00 - 02:00 | 0 | -80 | 0 | 0 |
| 23.11.2016 02:00 - 03:00 | 0 | -80 | 0 | 0 |
| 23.11.2016 03:00 - 04:00 | 0 | -80 | 0 | 0 |
| 23.11.2016 04:00 - 05:00 | 0 | -80 | 0 | 0 |
| 23.11.2016 05:00 - 06:00 | 0 | -80 | 0 | 0 |
| 23.11.2016 06:00 - 07:00 | 0 | 0 | 0 | 0 |
| 23.11.2016 07:00 - 08:00 | 0 | 0 | 0 | 0 |
| 23.11.2016 08:00 - 09:00 | 0 | 0 | 0 | 0 |
| 23.11.2016 09:00 - 10:00 | 0 | 0 | 0 | 0 |
| 23.11.2016 10:00 - 11:00 | 0 | 0 | 0 | 0 |
| 23.11.2016 11:00 - 12:00 | 0 | 0 | 0 | 0 |
| 23.11.2016 12:00 - 13:00 | 0 | 0 | 0 | 0 |
| 23.11.2016 13:00 - 14:00 | 0 | 0 | 0 | 0 |
| 23.11.2016 14:00 - 15:00 | 0 | 0 | 0 | 0 |
| 23.11.2016 15:00 - 16:00 | 0 | 0 | 0 | 0 |
| 23.11.2016 16:00 - 17:00 | 0 | 0 | 0 | 0 |
| 23.11.2016 17:00 - 18:00 | 0 | 0 | 0 | 0 |
| 23.11.2016 18:00 - 19:00 | 0 | 0 | 0 | 0 |
| 23.11.2016 19:00 - 20:00 | 0 | 0 | 0 | 0 |
| 23.11.2016 20:00 - 21:00 | 0 | 0 | 0 | 0 |
| 23.11.2016 21:00 - 22:00 | 0 | 0 | 0 | 0 |
| 23.11.2016 22:00 - 23:00 | 0 | 0 | 0 | 0 |
| 23.11.2016 23:00 - 24:00 | 0 | 0 | 0 | 0 |
| 24.11.2016 00:00 - 01:00 | 0 | -30 | 0 | 0 |
| 24.11.2016 01:00 - 02:00 | 0 | -30 | 0 | 0 |
| 24.11.2016 02:00 - 03:00 | 0 | -100 | 0 | 0 |
| 24.11.2016 03:00 - 04:00 | 0 | -100 | 0 | 0 |
| 24.11.2016 04:00 - 05:00 | 0 | -100 | 0 | 0 |
| 24.11.2016 05:00 - 06:00 | 0 | -100 | 0 | 0 |
| 24.11.2016 06:00 - 07:00 | 0 | 0 | 0 | 0 |
| 24.11.2016 07:00 - 08:00 | 0 | 0 | 0 | 0 |
| 24.11.2016 08:00 - 09:00 | 0 | 0 | 0 | 0 |
| 24.11.2016 09:00 - 10:00 | 0 | 0 | 0 | 0 |
| 24.11.2016 10:00 - 11:00 | 0 | 0 | 0 | 0 |
| 24.11.2016 11:00 - 12:00 | 0 | 0 | 0 | 0 |
| 24.11.2016 12:00 - 13:00 | 0 | 0 | 0 | 0 |
| 24.11.2016 13:00 - 14:00 | 0 | 0 | 0 | 0 |
| 24.11.2016 14:00 - 15:00 | 0 | 0 | 0 | 0 |
| 24.11.2016 15:00 - 16:00 | 0 | 0 | 0 | 0 |
| 24.11.2016 16:00 - 17:00 | 0 | 0 | 0 | 0 |
| 24.11.2016 17:00 - 18:00 | 0 | 0 | 0 | 0 |
| 24.11.2016 18:00 - 19:00 | 0 | 0 | 0 | 0 |
| 24.11.2016 19:00 - 20:00 | 0 | 0 | 0 | 0 |
| 24.11.2016 20:00 - 21:00 | 0 | 0 | 0 | 0 |
| 24.11.2016 21:00 - 22:00 | 0 | 0 | 0 | 0 |
| 24.11.2016 22:00 - 23:00 | 0 | 0 | 0 | 0 |
| 24.11.2016 23:00 - 24:00 | 0 | 0 | 0 | 0 |
| 25.11.2016 00:00 - 01:00 | 0 | 0 | 0 | 0 |
| 25.11.2016 01:00 - 02:00 | 0 | 0 | 0 | 0 |
| 25.11.2016 02:00 - 03:00 | 0 | 0 | 0 | 0 |
| 25.11.2016 03:00 - 04:00 | 0 | 0 | 0 | 0 |
| 25.11.2016 04:00 - 05:00 | 119 | 0 | 0 | 0 |
| 25.11.2016 05:00 - 06:00 | 119 | 0 | 0 | 0 |
| 25.11.2016 06:00 - 07:00 | 0 | 0 | 0 | 0 |
| 25.11.2016 07:00 - 08:00 | 0 | 0 | 0 | 0 |
| 25.11.2016 08:00 - 09:00 | 0 | 0 | 0 | 0 |
| 25.11.2016 09:00 - 10:00 | 0 | 0 | 0 | 0 |
| 25.11.2016 10:00 - 11:00 | 0 | 0 | 0 | 0 |
| 25.11.2016 11:00 - 12:00 | 0 | 0 | 0 | 0 |
| 25.11.2016 12:00 - 13:00 | 0 | 0 | 0 | 0 |
| 25.11.2016 13:00 - 14:00 | 20 | 0 | 0 | 0 |
| 25.11.2016 14:00 - 15:00 | 20 | 0 | 0 | 0 |
| 25.11.2016 15:00 - 16:00 | 40 | 0 | 0 | 0 |
| 25.11.2016 16:00 - 17:00 | 40 | 0 | 0 | 0 |
| 25.11.2016 17:00 - 18:00 | 40 | 0 | 0 | 0 |
| 25.11.2016 18:00 - 19:00 | 40 | 0 | 0 | 0 |
| 25.11.2016 19:00 - 20:00 | 40 | 0 | 0 | 0 |
| 25.11.2016 20:00 - 21:00 | 70 | 0 | 0 | 0 |
| 25.11.2016 21:00 - 22:00 | 70 | 0 | 0 | 0 |
| 25.11.2016 22:00 - 23:00 | 70 | 0 | 0 | 0 |
| 25.11.2016 23:00 - 24:00 | 90 | 0 | 0 | 0 |
| 26.11.2016 00:00 - 01:00 | 90 | 0 | 0 | 0 |
| 26.11.2016 01:00 - 02:00 | 90 | 0 | 0 | 0 |
| 26.11.2016 02:00 - 03:00 | 90 | 0 | 0 | 0 |
| 26.11.2016 03:00 - 04:00 | 90 | 0 | 0 | 0 |
| 26.11.2016 04:00 - 05:00 | 90 | 0 | 0 | 0 |
| 26.11.2016 05:00 - 06:00 | 90 | 0 | 0 | 0 |
| 26.11.2016 06:00 - 07:00 | 0 | 0 | 0 | 0 |
| 26.11.2016 07:00 - 08:00 | 0 | 0 | 0 | 0 |
| 26.11.2016 08:00 - 09:00 | 0 | 0 | 0 | 0 |
| 26.11.2016 09:00 - 10:00 | 0 | 0 | 0 | 0 |
| 26.11.2016 10:00 - 11:00 | 0 | 0 | 0 | 0 |
| 26.11.2016 11:00 - 12:00 | 0 | 0 | 0 | 0 |
| 26.11.2016 12:00 - 13:00 | 0 | 0 | 0 | 0 |
| 26.11.2016 13:00 - 14:00 | 0 | 0 | 0 | 0 |
| 26.11.2016 14:00 - 15:00 | 0 | 0 | 0 | 0 |
| 26.11.2016 15:00 - 16:00 | 0 | 0 | 0 | 0 |
| 26.11.2016 16:00 - 17:00 | 0 | 0 | 0 | 0 |
| 26.11.2016 17:00 - 18:00 | 0 | 0 | 0 | 0 |
| 26.11.2016 18:00 - 19:00 | 0 | 0 | 0 | 0 |
| 26.11.2016 19:00 - 20:00 | 0 | 0 | 0 | 0 |
| 26.11.2016 20:00 - 21:00 | 0 | 0 | 0 | 0 |
| 26.11.2016 21:00 - 22:00 | 0 | 0 | 0 | 0 |
| 26.11.2016 22:00 - 23:00 | 0 | 0 | 0 | 0 |
| 26.11.2016 23:00 - 24:00 | 0 | 0 | 0 | 0 |
| 27.11.2016 00:00 - 01:00 | 0 | 0 | 0 | 0 |
| 27.11.2016 01:00 - 02:00 | 0 | 0 | 0 | 0 |
| 27.11.2016 02:00 - 03:00 | 0 | 0 | 0 | 0 |
| 27.11.2016 03:00 - 04:00 | 0 | 0 | 0 | 0 |
| 27.11.2016 04:00 - 05:00 | 0 | 0 | 0 | 0 |
| 27.11.2016 05:00 - 06:00 | 0 | 0 | 0 | 0 |
| 27.11.2016 06:00 - 07:00 | 0 | 0 | 0 | 0 |
| 27.11.2016 07:00 - 08:00 | 0 | 0 | 0 | 0 |
| 27.11.2016 08:00 - 09:00 | 0 | 0 | 0 | 0 |
| 27.11.2016 09:00 - 10:00 | 0 | 0 | 0 | 0 |
| 27.11.2016 10:00 - 11:00 | 0 | 0 | 0 | 0 |
| 27.11.2016 11:00 - 12:00 | 0 | 0 | 0 | 0 |
| 27.11.2016 12:00 - 13:00 | 0 | 0 | 0 | 0 |
| 27.11.2016 13:00 - 14:00 | 0 | 0 | 0 | 0 |
| 27.11.2016 14:00 - 15:00 | 0 | 0 | 0 | 0 |
| 27.11.2016 15:00 - 16:00 | 0 | 0 | 0 | 0 |
| 27.11.2016 16:00 - 17:00 | 0 | 0 | 0 | 0 |
| 27.11.2016 17:00 - 18:00 | 0 | 0 | 0 | 0 |
| 27.11.2016 18:00 - 19:00 | 0 | 0 | 0 | 0 |
| 27.11.2016 19:00 - 20:00 | 0 | 0 | 0 | 0 |
| 27.11.2016 20:00 - 21:00 | 0 | -100 | 0 | 0 |
| 27.11.2016 21:00 - 22:00 | 0 | -100 | 0 | 0 |
| 27.11.2016 22:00 - 23:00 | 0 | -100 | 0 | 0 |
| 27.11.2016 23:00 - 24:00 | 0 | -100 | 0 | 0 |
| 28.11.2016 00:00 - 01:00 | 0 | -100 | 0 | 0 |
| 28.11.2016 01:00 - 02:00 | 0 | -100 | 0 | 0 |
| 28.11.2016 02:00 - 03:00 | 0 | -100 | 0 | 0 |
| 28.11.2016 03:00 - 04:00 | 0 | -100 | 0 | 0 |
| 28.11.2016 04:00 - 05:00 | 0 | -100 | 0 | 0 |
| 28.11.2016 05:00 - 06:00 | 0 | -100 | 0 | 0 |
| 28.11.2016 06:00 - 07:00 | 0 | 0 | 0 | 0 |
| 28.11.2016 07:00 - 08:00 | 0 | 0 | 0 | 0 |
| 28.11.2016 08:00 - 09:00 | 0 | 0 | 0 | 0 |
| 28.11.2016 09:00 - 10:00 | 0 | 0 | 0 | 0 |
| 28.11.2016 10:00 - 11:00 | 0 | 0 | 0 | 0 |
| 28.11.2016 11:00 - 12:00 | 0 | 0 | 0 | 0 |
| 28.11.2016 12:00 - 13:00 | 0 | 0 | 0 | 0 |
| 28.11.2016 13:00 - 14:00 | 0 | 0 | 0 | 0 |
| 28.11.2016 14:00 - 15:00 | 0 | 0 | 0 | 0 |
| 28.11.2016 15:00 - 16:00 | 0 | 0 | 0 | 0 |
| 28.11.2016 16:00 - 17:00 | 0 | 0 | 0 | 0 |
| 28.11.2016 17:00 - 18:00 | 0 | 0 | 0 | 0 |
| 28.11.2016 18:00 - 19:00 | 0 | 0 | 0 | 0 |
| 28.11.2016 19:00 - 20:00 | 0 | 0 | 0 | 0 |
| 28.11.2016 20:00 - 21:00 | 0 | 0 | 0 | 0 |
| 28.11.2016 21:00 - 22:00 | 0 | 0 | 0 | 0 |
| 28.11.2016 22:00 - 23:00 | 0 | 0 | 0 | 0 |
| 28.11.2016 23:00 - 24:00 | 0 | 0 | 0 | 0 |
| 29.11.2016 00:00 - 01:00 | 0 | 0 | 0 | 0 |
| 29.11.2016 01:00 - 02:00 | 0 | 0 | 0 | 0 |
| 29.11.2016 02:00 - 03:00 | 100 | 0 | 0 | 0 |
| 29.11.2016 03:00 - 04:00 | 150 | 0 | 0 | 0 |
| 29.11.2016 04:00 - 05:00 | 150 | 0 | 0 | 0 |
| 29.11.2016 05:00 - 06:00 | 150 | 0 | 0 | 0 |
| 29.11.2016 06:00 - 07:00 | 0 | 0 | 0 | 0 |
| 29.11.2016 07:00 - 08:00 | 0 | 0 | 0 | 0 |
| 29.11.2016 08:00 - 09:00 | 0 | 0 | 0 | 0 |
| 29.11.2016 09:00 - 10:00 | 0 | 0 | 0 | 0 |
| 29.11.2016 10:00 - 11:00 | 0 | 0 | 0 | 0 |
| 29.11.2016 11:00 - 12:00 | 0 | 0 | 0 | 0 |
| 29.11.2016 12:00 - 13:00 | 0 | 0 | 0 | 0 |
| 29.11.2016 13:00 - 14:00 | 0 | 0 | 0 | 0 |
| 29.11.2016 14:00 - 15:00 | 60 | 0 | 0 | 0 |
| 29.11.2016 15:00 - 16:00 | 120 | 0 | 0 | 0 |
| 29.11.2016 16:00 - 17:00 | 220 | 0 | 0 | 0 |
| 29.11.2016 17:00 - 18:00 | 270 | 0 | 0 | 0 |
| 29.11.2016 18:00 - 19:00 | 270 | 0 | 0 | 0 |
| 29.11.2016 19:00 - 20:00 | 270 | 0 | 0 | 0 |
| 29.11.2016 20:00 - 21:00 | 270 | -200 | 0 | 0 |
| 29.11.2016 21:00 - 22:00 | 270 | -300 | 0 | 0 |
| 29.11.2016 22:00 - 23:00 | 270 | -300 | 0 | 0 |
| 29.11.2016 23:00 - 24:00 | 270 | -300 | 0 | 0 |
| 30.11.2016 00:00 - 01:00 | 270 | -300 | 0 | 0 |
| 30.11.2016 01:00 - 02:00 | 270 | -300 | 0 | 0 |
| 30.11.2016 02:00 - 03:00 | 270 | -300 | 0 | 0 |
| 30.11.2016 03:00 - 04:00 | 270 | -300 | 0 | 0 |
| 30.11.2016 04:00 - 05:00 | 270 | -300 | 0 | 0 |
| 30.11.2016 05:00 - 06:00 | 270 | -300 | 0 | 0 |
| 30.11.2016 06:00 - 07:00 | 0 | 0 | 0 | 0 |
| 30.11.2016 07:00 - 08:00 | 0 | 0 | 0 | 0 |
| 30.11.2016 08:00 - 09:00 | 0 | 0 | 0 | 0 |
| 30.11.2016 09:00 - 10:00 | 0 | 0 | 0 | 0 |
| 30.11.2016 10:00 - 11:00 | 0 | 0 | 0 | 0 |
| 30.11.2016 11:00 - 12:00 | 80 | 0 | 0 | 0 |
| 30.11.2016 12:00 - 13:00 | 80 | 0 | 0 | 0 |
| 30.11.2016 13:00 - 14:00 | 80 | 0 | 0 | 0 |
| 30.11.2016 14:00 - 15:00 | 80 | 0 | 0 | 0 |
| 30.11.2016 15:00 - 16:00 | 80 | 0 | 0 | 0 |
| 30.11.2016 16:00 - 17:00 | 80 | 0 | 0 | 0 |
| 30.11.2016 17:00 - 18:00 | 80 | 0 | 0 | 0 |
| 30.11.2016 18:00 - 19:00 | 80 | 0 | 0 | 0 |
| 30.11.2016 19:00 - 20:00 | 80 | 0 | 0 | 0 |
| 30.11.2016 20:00 - 21:00 | 80 | 0 | 0 | 0 |
| 30.11.2016 21:00 - 22:00 | 80 | 0 | 0 | 0 |
| 30.11.2016 22:00 - 23:00 | 80 | 0 | 0 | 0 |
| 30.11.2016 23:00 - 24:00 | 80 | 0 | 0 | 0 |
| 01.12.2016 00:00 - 01:00 | 80 | 0 | 0 | 0 |
| 01.12.2016 01:00 - 02:00 | 80 | 0 | 0 | 0 |
| 01.12.2016 02:00 - 03:00 | 230 | 0 | 0 | 0 |
| 01.12.2016 03:00 - 04:00 | 230 | 0 | 0 | 0 |
| 01.12.2016 04:00 - 05:00 | 230 | 0 | 0 | 0 |
| 01.12.2016 05:00 - 06:00 | 230 | 0 | 0 | 0 |